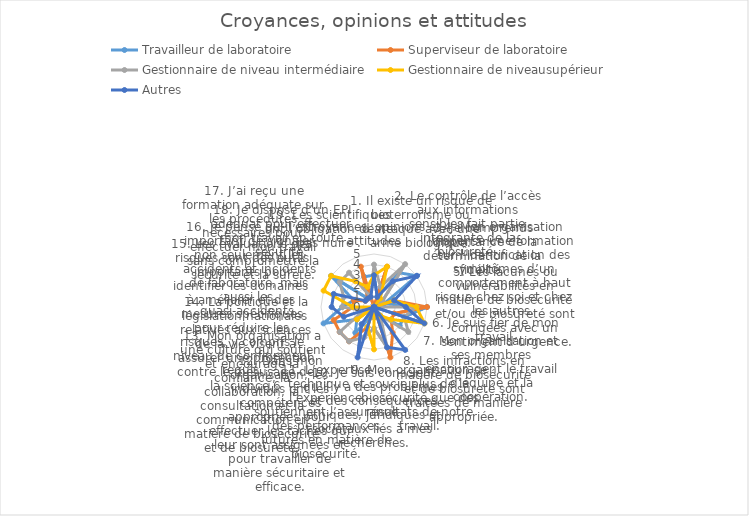
| Category | Travailleur de laboratoire | Superviseur de laboratoire | Gestionnaire de niveau intermédiaire | Gestionnaire de niveausupérieur | Autres |
|---|---|---|---|---|---|
| Croyances, opinions et attitudes | 3 | 0 | 4 | 3 | 3 |
| 1. Il existe un risque de bioterrorisme ou d’attaque avec une arme biologique. | 1 | 4 | 2 | 4 | 1 |
| 2. Le contrôle de l’accès aux informations sensibles fait partie intégrante de la biosûreté. | 4 | 0 | 5 | 1 | 3 |
| 3. Je comprends l’importance de la détermination de la fidélité. | 5 | 0 | 1 | 0 | 5 |
| 4. Mon organisation dispense une formation sur l’identification des symptômes d’un comportement à haut risque chez soi et chez les autres. | 1 | 2 | 0 | 2 | 2 |
| 5. Les lacunes ou vulnérabilités en matière de biosécurité et/ou de biosûreté sont corrigées avec un sentiment d’urgence. | 5 | 5 | 4 | 4 | 3 |
| 6. Je suis fier de mon travail. | 3 | 2 | 3 | 5 | 5 |
| 7. Mon organisation et ses membres encouragent le travail d’équipe et la coopération. | 3 | 2 | 4 | 2 | 0 |
| 8. Les infractions en matière de biosécurité et de biosûreté sont traitées de manière appropriée. | 1 | 3 | 1 | 1 | 5 |
| 9. Mon organisation se soucie plus de la biosécurité que des résultats de notre travail. | 0 | 5 | 4 | 0 | 4 |
| 10. Je suis conscient qu’il y a des problèmes et des conséquences éthiques, juridiques et sociétaux liés à mes recherches. | 1 | 0 | 2 | 4 | 0 |
| 11. L’expertise technique et l’expérience soutiennent l’assurance des performances futures en matière de biosécurité. | 1 | 2 | 3 | 2 | 5 |
| 12. Dans mon organisation, les individus ont les compétences appropriées pour effectuer les tâches qui leur sont assignées et pour travailler de manière sécuritaire et efficace. | 3 | 4 | 4 | 0 | 2 |
| 13. Mon organisation a une culture qui soutient et encourage la confiance, la collaboration, la consultation et la communication en matière de biosécurité et de biosûreté. | 2 | 4 | 4 | 2 | 0 |
| 14. La politique et la législation nationales relatives aux sciences de la vie visent à assurer une protection contre le mésusage de la science.6 | 5 | 4 | 1 | 0 | 3 |
| 15. Les évaluations des risques sont des outils importants pour identifier les domaines à améliorer et des mesures spécifiques pour réduire les risques, y compris le niveau de confinement requis. | 3 | 2 | 3 | 2 | 4 |
| 16. Je pense qu’il est important de signaler non seulement les accidents et incidents de laboratoire, mais aussi les quasi-accidents. | 2 | 2 | 3 | 5 | 4 |
| 17. J’ai reçu une formation adéquate sur les procédures nécessaires pour effectuer mon travail sans compromettre la sécurité et la sûreté. | 5 | 1 | 4 | 5 | 1 |
| 18. Je dispose d’un EPI adéquat pour effectuer mon travail en toute sécurité. | 1 | 1 | 4 | 3 | 1 |
| 19. Les scientifiques ont l’obligation de ne pas nuire . | 3 | 4 | 1 | 2 | 1 |